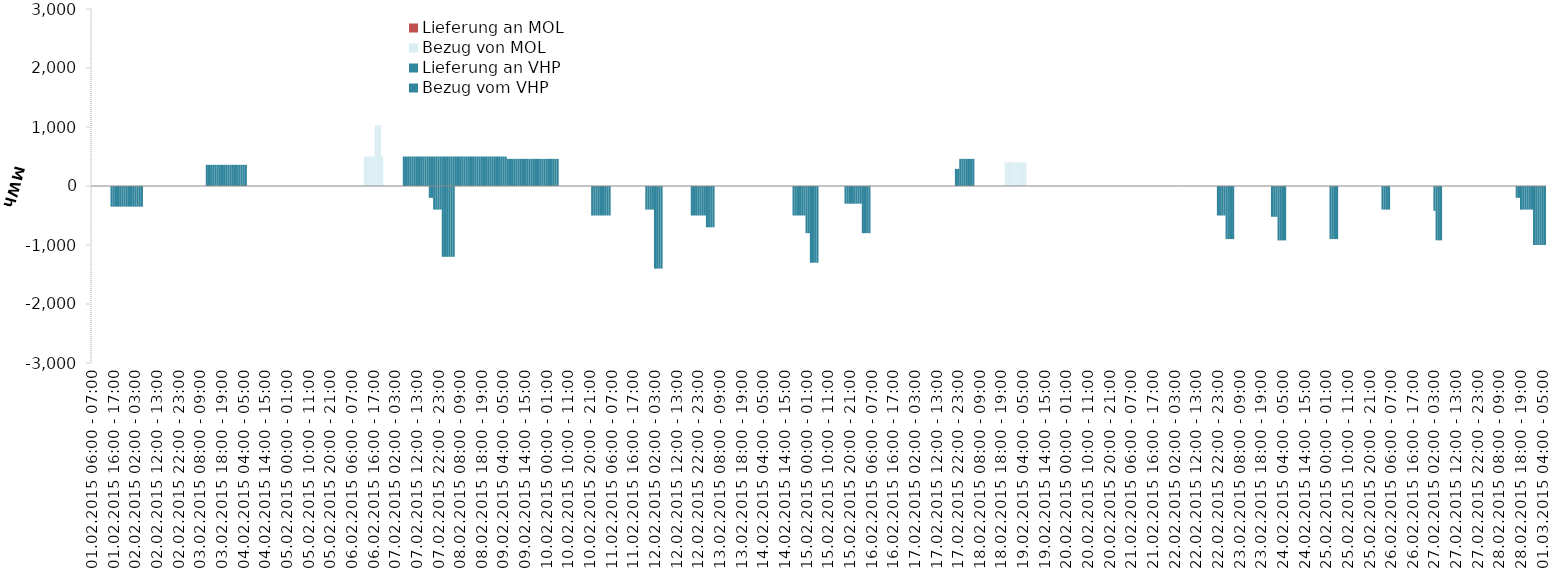
| Category | Bezug vom VHP | Lieferung an VHP | Bezug von MOL | Lieferung an MOL |
|---|---|---|---|---|
| 01.02.2015 06:00 - 07:00 | 0 | 0 | 0 | 0 |
| 01.02.2015 07:00 - 08:00 | 0 | 0 | 0 | 0 |
| 01.02.2015 08:00 - 09:00 | 0 | 0 | 0 | 0 |
| 01.02.2015 09:00 - 10:00 | 0 | 0 | 0 | 0 |
| 01.02.2015 10:00 - 11:00 | 0 | 0 | 0 | 0 |
| 01.02.2015 11:00 - 12:00 | 0 | 0 | 0 | 0 |
| 01.02.2015 12:00 - 13:00 | 0 | 0 | 0 | 0 |
| 01.02.2015 13:00 - 14:00 | 0 | 0 | 0 | 0 |
| 01.02.2015 14:00 - 15:00 | 0 | 0 | 0 | 0 |
| 01.02.2015 15:00 - 16:00 | 0 | -350 | 0 | 0 |
| 01.02.2015 16:00 - 17:00 | 0 | -350 | 0 | 0 |
| 01.02.2015 17:00 - 18:00 | 0 | -350 | 0 | 0 |
| 01.02.2015 18:00 - 19:00 | 0 | -350 | 0 | 0 |
| 01.02.2015 19:00 - 20:00 | 0 | -350 | 0 | 0 |
| 01.02.2015 20:00 - 21:00 | 0 | -350 | 0 | 0 |
| 01.02.2015 21:00 - 22:00 | 0 | -350 | 0 | 0 |
| 01.02.2015 22:00 - 23:00 | 0 | -350 | 0 | 0 |
| 01.02.2015 23:00 - 24:00 | 0 | -350 | 0 | 0 |
| 02.02.2015 00:00 - 01:00 | 0 | -350 | 0 | 0 |
| 02.02.2015 01:00 - 02:00 | 0 | -350 | 0 | 0 |
| 02.02.2015 02:00 - 03:00 | 0 | -350 | 0 | 0 |
| 02.02.2015 03:00 - 04:00 | 0 | -350 | 0 | 0 |
| 02.02.2015 04:00 - 05:00 | 0 | -350 | 0 | 0 |
| 02.02.2015 05:00 - 06:00 | 0 | -350 | 0 | 0 |
| 02.02.2015 06:00 - 07:00 | 0 | 0 | 0 | 0 |
| 02.02.2015 07:00 - 08:00 | 0 | 0 | 0 | 0 |
| 02.02.2015 08:00 - 09:00 | 0 | 0 | 0 | 0 |
| 02.02.2015 09:00 - 10:00 | 0 | 0 | 0 | 0 |
| 02.02.2015 10:00 - 11:00 | 0 | 0 | 0 | 0 |
| 02.02.2015 11:00 - 12:00 | 0 | 0 | 0 | 0 |
| 02.02.2015 12:00 - 13:00 | 0 | 0 | 0 | 0 |
| 02.02.2015 13:00 - 14:00 | 0 | 0 | 0 | 0 |
| 02.02.2015 14:00 - 15:00 | 0 | 0 | 0 | 0 |
| 02.02.2015 15:00 - 16:00 | 0 | 0 | 0 | 0 |
| 02.02.2015 16:00 - 17:00 | 0 | 0 | 0 | 0 |
| 02.02.2015 17:00 - 18:00 | 0 | 0 | 0 | 0 |
| 02.02.2015 18:00 - 19:00 | 0 | 0 | 0 | 0 |
| 02.02.2015 19:00 - 20:00 | 0 | 0 | 0 | 0 |
| 02.02.2015 20:00 - 21:00 | 0 | 0 | 0 | 0 |
| 02.02.2015 21:00 - 22:00 | 0 | 0 | 0 | 0 |
| 02.02.2015 22:00 - 23:00 | 0 | 0 | 0 | 0 |
| 02.02.2015 23:00 - 24:00 | 0 | 0 | 0 | 0 |
| 03.02.2015 00:00 - 01:00 | 0 | 0 | 0 | 0 |
| 03.02.2015 01:00 - 02:00 | 0 | 0 | 0 | 0 |
| 03.02.2015 02:00 - 03:00 | 0 | 0 | 0 | 0 |
| 03.02.2015 03:00 - 04:00 | 0 | 0 | 0 | 0 |
| 03.02.2015 04:00 - 05:00 | 0 | 0 | 0 | 0 |
| 03.02.2015 05:00 - 06:00 | 0 | 0 | 0 | 0 |
| 03.02.2015 06:00 - 07:00 | 0 | 0 | 0 | 0 |
| 03.02.2015 07:00 - 08:00 | 0 | 0 | 0 | 0 |
| 03.02.2015 08:00 - 09:00 | 0 | 0 | 0 | 0 |
| 03.02.2015 09:00 - 10:00 | 0 | 0 | 0 | 0 |
| 03.02.2015 10:00 - 11:00 | 0 | 0 | 0 | 0 |
| 03.02.2015 11:00 - 12:00 | 359 | 0 | 0 | 0 |
| 03.02.2015 12:00 - 13:00 | 359 | 0 | 0 | 0 |
| 03.02.2015 13:00 - 14:00 | 359 | 0 | 0 | 0 |
| 03.02.2015 14:00 - 15:00 | 359 | 0 | 0 | 0 |
| 03.02.2015 15:00 - 16:00 | 359 | 0 | 0 | 0 |
| 03.02.2015 16:00 - 17:00 | 359 | 0 | 0 | 0 |
| 03.02.2015 17:00 - 18:00 | 359 | 0 | 0 | 0 |
| 03.02.2015 18:00 - 19:00 | 359 | 0 | 0 | 0 |
| 03.02.2015 19:00 - 20:00 | 359 | 0 | 0 | 0 |
| 03.02.2015 20:00 - 21:00 | 359 | 0 | 0 | 0 |
| 03.02.2015 21:00 - 22:00 | 359 | 0 | 0 | 0 |
| 03.02.2015 22:00 - 23:00 | 359 | 0 | 0 | 0 |
| 03.02.2015 23:00 - 24:00 | 359 | 0 | 0 | 0 |
| 04.02.2015 00:00 - 01:00 | 359 | 0 | 0 | 0 |
| 04.02.2015 01:00 - 02:00 | 359 | 0 | 0 | 0 |
| 04.02.2015 02:00 - 03:00 | 359 | 0 | 0 | 0 |
| 04.02.2015 03:00 - 04:00 | 359 | 0 | 0 | 0 |
| 04.02.2015 04:00 - 05:00 | 359 | 0 | 0 | 0 |
| 04.02.2015 05:00 - 06:00 | 359 | 0 | 0 | 0 |
| 04.02.2015 06:00 - 07:00 | 0 | 0 | 0 | 0 |
| 04.02.2015 07:00 - 08:00 | 0 | 0 | 0 | 0 |
| 04.02.2015 08:00 - 09:00 | 0 | 0 | 0 | 0 |
| 04.02.2015 09:00 - 10:00 | 0 | 0 | 0 | 0 |
| 04.02.2015 10:00 - 11:00 | 0 | 0 | 0 | 0 |
| 04.02.2015 11:00 - 12:00 | 0 | 0 | 0 | 0 |
| 04.02.2015 12:00 - 13:00 | 0 | 0 | 0 | 0 |
| 04.02.2015 13:00 - 14:00 | 0 | 0 | 0 | 0 |
| 04.02.2015 14:00 - 15:00 | 0 | 0 | 0 | 0 |
| 04.02.2015 15:00 - 16:00 | 0 | 0 | 0 | 0 |
| 04.02.2015 16:00 - 17:00 | 0 | 0 | 0 | 0 |
| 04.02.2015 17:00 - 18:00 | 0 | 0 | 0 | 0 |
| 04.02.2015 18:00 - 19:00 | 0 | 0 | 0 | 0 |
| 04.02.2015 19:00 - 20:00 | 0 | 0 | 0 | 0 |
| 04.02.2015 20:00 - 21:00 | 0 | 0 | 0 | 0 |
| 04.02.2015 21:00 - 22:00 | 0 | 0 | 0 | 0 |
| 04.02.2015 22:00 - 23:00 | 0 | 0 | 0 | 0 |
| 04.02.2015 23:00 - 24:00 | 0 | 0 | 0 | 0 |
| 05.02.2015 00:00 - 01:00 | 0 | 0 | 0 | 0 |
| 05.02.2015 01:00 - 02:00 | 0 | 0 | 0 | 0 |
| 05.02.2015 02:00 - 03:00 | 0 | 0 | 0 | 0 |
| 05.02.2015 03:00 - 04:00 | 0 | 0 | 0 | 0 |
| 05.02.2015 04:00 - 05:00 | 0 | 0 | 0 | 0 |
| 05.02.2015 05:00 - 06:00 | 0 | 0 | 0 | 0 |
| 05.02.2015 06:00 - 07:00 | 0 | 0 | 0 | 0 |
| 05.02.2015 07:00 - 08:00 | 0 | 0 | 0 | 0 |
| 05.02.2015 08:00 - 09:00 | 0 | 0 | 0 | 0 |
| 05.02.2015 09:00 - 10:00 | 0 | 0 | 0 | 0 |
| 05.02.2015 10:00 - 11:00 | 0 | 0 | 0 | 0 |
| 05.02.2015 11:00 - 12:00 | 0 | 0 | 0 | 0 |
| 05.02.2015 12:00 - 13:00 | 0 | 0 | 0 | 0 |
| 05.02.2015 13:00 - 14:00 | 0 | 0 | 0 | 0 |
| 05.02.2015 14:00 - 15:00 | 0 | 0 | 0 | 0 |
| 05.02.2015 15:00 - 16:00 | 0 | 0 | 0 | 0 |
| 05.02.2015 16:00 - 17:00 | 0 | 0 | 0 | 0 |
| 05.02.2015 17:00 - 18:00 | 0 | 0 | 0 | 0 |
| 05.02.2015 18:00 - 19:00 | 0 | 0 | 0 | 0 |
| 05.02.2015 19:00 - 20:00 | 0 | 0 | 0 | 0 |
| 05.02.2015 20:00 - 21:00 | 0 | 0 | 0 | 0 |
| 05.02.2015 21:00 - 22:00 | 0 | 0 | 0 | 0 |
| 05.02.2015 22:00 - 23:00 | 0 | 0 | 0 | 0 |
| 05.02.2015 23:00 - 24:00 | 0 | 0 | 0 | 0 |
| 06.02.2015 00:00 - 01:00 | 0 | 0 | 0 | 0 |
| 06.02.2015 01:00 - 02:00 | 0 | 0 | 0 | 0 |
| 06.02.2015 02:00 - 03:00 | 0 | 0 | 0 | 0 |
| 06.02.2015 03:00 - 04:00 | 0 | 0 | 0 | 0 |
| 06.02.2015 04:00 - 05:00 | 0 | 0 | 0 | 0 |
| 06.02.2015 05:00 - 06:00 | 0 | 0 | 0 | 0 |
| 06.02.2015 06:00 - 07:00 | 0 | 0 | 0 | 0 |
| 06.02.2015 07:00 - 08:00 | 0 | 0 | 0 | 0 |
| 06.02.2015 08:00 - 09:00 | 0 | 0 | 0 | 0 |
| 06.02.2015 09:00 - 10:00 | 0 | 0 | 0 | 0 |
| 06.02.2015 10:00 - 11:00 | 0 | 0 | 0 | 0 |
| 06.02.2015 11:00 - 12:00 | 0 | 0 | 0 | 0 |
| 06.02.2015 12:00 - 13:00 | 0 | 0 | 500 | 0 |
| 06.02.2015 13:00 - 14:00 | 0 | 0 | 500 | 0 |
| 06.02.2015 14:00 - 15:00 | 0 | 0 | 500 | 0 |
| 06.02.2015 15:00 - 16:00 | 0 | 0 | 500 | 0 |
| 06.02.2015 16:00 - 17:00 | 0 | 0 | 500 | 0 |
| 06.02.2015 17:00 - 18:00 | 0 | 0 | 1030 | 0 |
| 06.02.2015 18:00 - 19:00 | 0 | 0 | 1030 | 0 |
| 06.02.2015 19:00 - 20:00 | 0 | 0 | 1030 | 0 |
| 06.02.2015 20:00 - 21:00 | 0 | 0 | 500 | 0 |
| 06.02.2015 21:00 - 22:00 | 0 | 0 | 0 | 0 |
| 06.02.2015 22:00 - 23:00 | 0 | 0 | 0 | 0 |
| 06.02.2015 23:00 - 24:00 | 0 | 0 | 0 | 0 |
| 07.02.2015 00:00 - 01:00 | 0 | 0 | 0 | 0 |
| 07.02.2015 01:00 - 02:00 | 0 | 0 | 0 | 0 |
| 07.02.2015 02:00 - 03:00 | 0 | 0 | 0 | 0 |
| 07.02.2015 03:00 - 04:00 | 0 | 0 | 0 | 0 |
| 07.02.2015 04:00 - 05:00 | 0 | 0 | 0 | 0 |
| 07.02.2015 05:00 - 06:00 | 0 | 0 | 0 | 0 |
| 07.02.2015 06:00 - 07:00 | 500 | 0 | 0 | 0 |
| 07.02.2015 07:00 - 08:00 | 500 | 0 | 0 | 0 |
| 07.02.2015 08:00 - 09:00 | 500 | 0 | 0 | 0 |
| 07.02.2015 09:00 - 10:00 | 500 | 0 | 0 | 0 |
| 07.02.2015 10:00 - 11:00 | 500 | 0 | 0 | 0 |
| 07.02.2015 11:00 - 12:00 | 500 | 0 | 0 | 0 |
| 07.02.2015 12:00 - 13:00 | 500 | 0 | 0 | 0 |
| 07.02.2015 13:00 - 14:00 | 500 | 0 | 0 | 0 |
| 07.02.2015 14:00 - 15:00 | 500 | 0 | 0 | 0 |
| 07.02.2015 15:00 - 16:00 | 500 | 0 | 0 | 0 |
| 07.02.2015 16:00 - 17:00 | 500 | 0 | 0 | 0 |
| 07.02.2015 17:00 - 18:00 | 500 | 0 | 0 | 0 |
| 07.02.2015 18:00 - 19:00 | 500 | -200 | 0 | 0 |
| 07.02.2015 19:00 - 20:00 | 500 | -200 | 0 | 0 |
| 07.02.2015 20:00 - 21:00 | 500 | -400 | 0 | 0 |
| 07.02.2015 21:00 - 22:00 | 500 | -400 | 0 | 0 |
| 07.02.2015 22:00 - 23:00 | 500 | -400 | 0 | 0 |
| 07.02.2015 23:00 - 24:00 | 500 | -400 | 0 | 0 |
| 08.02.2015 00:00 - 01:00 | 500 | -1200 | 0 | 0 |
| 08.02.2015 01:00 - 02:00 | 500 | -1200 | 0 | 0 |
| 08.02.2015 02:00 - 03:00 | 500 | -1200 | 0 | 0 |
| 08.02.2015 03:00 - 04:00 | 500 | -1200 | 0 | 0 |
| 08.02.2015 04:00 - 05:00 | 500 | -1200 | 0 | 0 |
| 08.02.2015 05:00 - 06:00 | 500 | -1200 | 0 | 0 |
| 08.02.2015 06:00 - 07:00 | 500 | 0 | 0 | 0 |
| 08.02.2015 07:00 - 08:00 | 500 | 0 | 0 | 0 |
| 08.02.2015 08:00 - 09:00 | 500 | 0 | 0 | 0 |
| 08.02.2015 09:00 - 10:00 | 500 | 0 | 0 | 0 |
| 08.02.2015 10:00 - 11:00 | 500 | 0 | 0 | 0 |
| 08.02.2015 11:00 - 12:00 | 500 | 0 | 0 | 0 |
| 08.02.2015 12:00 - 13:00 | 500 | 0 | 0 | 0 |
| 08.02.2015 13:00 - 14:00 | 500 | 0 | 0 | 0 |
| 08.02.2015 14:00 - 15:00 | 500 | 0 | 0 | 0 |
| 08.02.2015 15:00 - 16:00 | 500 | 0 | 0 | 0 |
| 08.02.2015 16:00 - 17:00 | 500 | 0 | 0 | 0 |
| 08.02.2015 17:00 - 18:00 | 500 | 0 | 0 | 0 |
| 08.02.2015 18:00 - 19:00 | 500 | 0 | 0 | 0 |
| 08.02.2015 19:00 - 20:00 | 500 | 0 | 0 | 0 |
| 08.02.2015 20:00 - 21:00 | 500 | 0 | 0 | 0 |
| 08.02.2015 21:00 - 22:00 | 500 | 0 | 0 | 0 |
| 08.02.2015 22:00 - 23:00 | 500 | 0 | 0 | 0 |
| 08.02.2015 23:00 - 24:00 | 500 | 0 | 0 | 0 |
| 09.02.2015 00:00 - 01:00 | 500 | 0 | 0 | 0 |
| 09.02.2015 01:00 - 02:00 | 500 | 0 | 0 | 0 |
| 09.02.2015 02:00 - 03:00 | 500 | 0 | 0 | 0 |
| 09.02.2015 03:00 - 04:00 | 500 | 0 | 0 | 0 |
| 09.02.2015 04:00 - 05:00 | 500 | 0 | 0 | 0 |
| 09.02.2015 05:00 - 06:00 | 500 | 0 | 0 | 0 |
| 09.02.2015 06:00 - 07:00 | 460 | 0 | 0 | 0 |
| 09.02.2015 07:00 - 08:00 | 460 | 0 | 0 | 0 |
| 09.02.2015 08:00 - 09:00 | 460 | 0 | 0 | 0 |
| 09.02.2015 09:00 - 10:00 | 460 | 0 | 0 | 0 |
| 09.02.2015 10:00 - 11:00 | 460 | 0 | 0 | 0 |
| 09.02.2015 11:00 - 12:00 | 460 | 0 | 0 | 0 |
| 09.02.2015 12:00 - 13:00 | 460 | 0 | 0 | 0 |
| 09.02.2015 13:00 - 14:00 | 460 | 0 | 0 | 0 |
| 09.02.2015 14:00 - 15:00 | 460 | 0 | 0 | 0 |
| 09.02.2015 15:00 - 16:00 | 460 | 0 | 0 | 0 |
| 09.02.2015 16:00 - 17:00 | 460 | 0 | 0 | 0 |
| 09.02.2015 17:00 - 18:00 | 460 | 0 | 0 | 0 |
| 09.02.2015 18:00 - 19:00 | 460 | 0 | 0 | 0 |
| 09.02.2015 19:00 - 20:00 | 460 | 0 | 0 | 0 |
| 09.02.2015 20:00 - 21:00 | 460 | 0 | 0 | 0 |
| 09.02.2015 21:00 - 22:00 | 460 | 0 | 0 | 0 |
| 09.02.2015 22:00 - 23:00 | 460 | 0 | 0 | 0 |
| 09.02.2015 23:00 - 24:00 | 460 | 0 | 0 | 0 |
| 10.02.2015 00:00 - 01:00 | 460 | 0 | 0 | 0 |
| 10.02.2015 01:00 - 02:00 | 460 | 0 | 0 | 0 |
| 10.02.2015 02:00 - 03:00 | 460 | 0 | 0 | 0 |
| 10.02.2015 03:00 - 04:00 | 460 | 0 | 0 | 0 |
| 10.02.2015 04:00 - 05:00 | 460 | 0 | 0 | 0 |
| 10.02.2015 05:00 - 06:00 | 460 | 0 | 0 | 0 |
| 10.02.2015 06:00 - 07:00 | 0 | 0 | 0 | 0 |
| 10.02.2015 07:00 - 08:00 | 0 | 0 | 0 | 0 |
| 10.02.2015 08:00 - 09:00 | 0 | 0 | 0 | 0 |
| 10.02.2015 09:00 - 10:00 | 0 | 0 | 0 | 0 |
| 10.02.2015 10:00 - 11:00 | 0 | 0 | 0 | 0 |
| 10.02.2015 11:00 - 12:00 | 0 | 0 | 0 | 0 |
| 10.02.2015 12:00 - 13:00 | 0 | 0 | 0 | 0 |
| 10.02.2015 13:00 - 14:00 | 0 | 0 | 0 | 0 |
| 10.02.2015 14:00 - 15:00 | 0 | 0 | 0 | 0 |
| 10.02.2015 15:00 - 16:00 | 0 | 0 | 0 | 0 |
| 10.02.2015 16:00 - 17:00 | 0 | 0 | 0 | 0 |
| 10.02.2015 17:00 - 18:00 | 0 | 0 | 0 | 0 |
| 10.02.2015 18:00 - 19:00 | 0 | 0 | 0 | 0 |
| 10.02.2015 19:00 - 20:00 | 0 | 0 | 0 | 0 |
| 10.02.2015 20:00 - 21:00 | 0 | 0 | 0 | 0 |
| 10.02.2015 21:00 - 22:00 | 0 | -500 | 0 | 0 |
| 10.02.2015 22:00 - 23:00 | 0 | -500 | 0 | 0 |
| 10.02.2015 23:00 - 24:00 | 0 | -500 | 0 | 0 |
| 11.02.2015 00:00 - 01:00 | 0 | -500 | 0 | 0 |
| 11.02.2015 01:00 - 02:00 | 0 | -500 | 0 | 0 |
| 11.02.2015 02:00 - 03:00 | 0 | -500 | 0 | 0 |
| 11.02.2015 03:00 - 04:00 | 0 | -500 | 0 | 0 |
| 11.02.2015 04:00 - 05:00 | 0 | -500 | 0 | 0 |
| 11.02.2015 05:00 - 06:00 | 0 | -500 | 0 | 0 |
| 11.02.2015 06:00 - 07:00 | 0 | 0 | 0 | 0 |
| 11.02.2015 07:00 - 08:00 | 0 | 0 | 0 | 0 |
| 11.02.2015 08:00 - 09:00 | 0 | 0 | 0 | 0 |
| 11.02.2015 09:00 - 10:00 | 0 | 0 | 0 | 0 |
| 11.02.2015 10:00 - 11:00 | 0 | 0 | 0 | 0 |
| 11.02.2015 11:00 - 12:00 | 0 | 0 | 0 | 0 |
| 11.02.2015 12:00 - 13:00 | 0 | 0 | 0 | 0 |
| 11.02.2015 13:00 - 14:00 | 0 | 0 | 0 | 0 |
| 11.02.2015 14:00 - 15:00 | 0 | 0 | 0 | 0 |
| 11.02.2015 15:00 - 16:00 | 0 | 0 | 0 | 0 |
| 11.02.2015 16:00 - 17:00 | 0 | 0 | 0 | 0 |
| 11.02.2015 17:00 - 18:00 | 0 | 0 | 0 | 0 |
| 11.02.2015 18:00 - 19:00 | 0 | 0 | 0 | 0 |
| 11.02.2015 19:00 - 20:00 | 0 | 0 | 0 | 0 |
| 11.02.2015 20:00 - 21:00 | 0 | 0 | 0 | 0 |
| 11.02.2015 21:00 - 22:00 | 0 | 0 | 0 | 0 |
| 11.02.2015 22:00 - 23:00 | 0 | -400 | 0 | 0 |
| 11.02.2015 23:00 - 24:00 | 0 | -400 | 0 | 0 |
| 12.02.2015 00:00 - 01:00 | 0 | -400 | 0 | 0 |
| 12.02.2015 01:00 - 02:00 | 0 | -400 | 0 | 0 |
| 12.02.2015 02:00 - 03:00 | 0 | -1400 | 0 | 0 |
| 12.02.2015 03:00 - 04:00 | 0 | -1400 | 0 | 0 |
| 12.02.2015 04:00 - 05:00 | 0 | -1400 | 0 | 0 |
| 12.02.2015 05:00 - 06:00 | 0 | -1400 | 0 | 0 |
| 12.02.2015 06:00 - 07:00 | 0 | 0 | 0 | 0 |
| 12.02.2015 07:00 - 08:00 | 0 | 0 | 0 | 0 |
| 12.02.2015 08:00 - 09:00 | 0 | 0 | 0 | 0 |
| 12.02.2015 09:00 - 10:00 | 0 | 0 | 0 | 0 |
| 12.02.2015 10:00 - 11:00 | 0 | 0 | 0 | 0 |
| 12.02.2015 11:00 - 12:00 | 0 | 0 | 0 | 0 |
| 12.02.2015 12:00 - 13:00 | 0 | 0 | 0 | 0 |
| 12.02.2015 13:00 - 14:00 | 0 | 0 | 0 | 0 |
| 12.02.2015 14:00 - 15:00 | 0 | 0 | 0 | 0 |
| 12.02.2015 15:00 - 16:00 | 0 | 0 | 0 | 0 |
| 12.02.2015 16:00 - 17:00 | 0 | 0 | 0 | 0 |
| 12.02.2015 17:00 - 18:00 | 0 | 0 | 0 | 0 |
| 12.02.2015 18:00 - 19:00 | 0 | 0 | 0 | 0 |
| 12.02.2015 19:00 - 20:00 | 0 | -500 | 0 | 0 |
| 12.02.2015 20:00 - 21:00 | 0 | -500 | 0 | 0 |
| 12.02.2015 21:00 - 22:00 | 0 | -500 | 0 | 0 |
| 12.02.2015 22:00 - 23:00 | 0 | -500 | 0 | 0 |
| 12.02.2015 23:00 - 24:00 | 0 | -500 | 0 | 0 |
| 13.02.2015 00:00 - 01:00 | 0 | -500 | 0 | 0 |
| 13.02.2015 01:00 - 02:00 | 0 | -500 | 0 | 0 |
| 13.02.2015 02:00 - 03:00 | 0 | -700 | 0 | 0 |
| 13.02.2015 03:00 - 04:00 | 0 | -700 | 0 | 0 |
| 13.02.2015 04:00 - 05:00 | 0 | -700 | 0 | 0 |
| 13.02.2015 05:00 - 06:00 | 0 | -700 | 0 | 0 |
| 13.02.2015 06:00 - 07:00 | 0 | 0 | 0 | 0 |
| 13.02.2015 07:00 - 08:00 | 0 | 0 | 0 | 0 |
| 13.02.2015 08:00 - 09:00 | 0 | 0 | 0 | 0 |
| 13.02.2015 09:00 - 10:00 | 0 | 0 | 0 | 0 |
| 13.02.2015 10:00 - 11:00 | 0 | 0 | 0 | 0 |
| 13.02.2015 11:00 - 12:00 | 0 | 0 | 0 | 0 |
| 13.02.2015 12:00 - 13:00 | 0 | 0 | 0 | 0 |
| 13.02.2015 13:00 - 14:00 | 0 | 0 | 0 | 0 |
| 13.02.2015 14:00 - 15:00 | 0 | 0 | 0 | 0 |
| 13.02.2015 15:00 - 16:00 | 0 | 0 | 0 | 0 |
| 13.02.2015 16:00 - 17:00 | 0 | 0 | 0 | 0 |
| 13.02.2015 17:00 - 18:00 | 0 | 0 | 0 | 0 |
| 13.02.2015 18:00 - 19:00 | 0 | 0 | 0 | 0 |
| 13.02.2015 19:00 - 20:00 | 0 | 0 | 0 | 0 |
| 13.02.2015 20:00 - 21:00 | 0 | 0 | 0 | 0 |
| 13.02.2015 21:00 - 22:00 | 0 | 0 | 0 | 0 |
| 13.02.2015 22:00 - 23:00 | 0 | 0 | 0 | 0 |
| 13.02.2015 23:00 - 24:00 | 0 | 0 | 0 | 0 |
| 14.02.2015 00:00 - 01:00 | 0 | 0 | 0 | 0 |
| 14.02.2015 01:00 - 02:00 | 0 | 0 | 0 | 0 |
| 14.02.2015 02:00 - 03:00 | 0 | 0 | 0 | 0 |
| 14.02.2015 03:00 - 04:00 | 0 | 0 | 0 | 0 |
| 14.02.2015 04:00 - 05:00 | 0 | 0 | 0 | 0 |
| 14.02.2015 05:00 - 06:00 | 0 | 0 | 0 | 0 |
| 14.02.2015 06:00 - 07:00 | 0 | 0 | 0 | 0 |
| 14.02.2015 07:00 - 08:00 | 0 | 0 | 0 | 0 |
| 14.02.2015 08:00 - 09:00 | 0 | 0 | 0 | 0 |
| 14.02.2015 09:00 - 10:00 | 0 | 0 | 0 | 0 |
| 14.02.2015 10:00 - 11:00 | 0 | 0 | 0 | 0 |
| 14.02.2015 11:00 - 12:00 | 0 | 0 | 0 | 0 |
| 14.02.2015 12:00 - 13:00 | 0 | 0 | 0 | 0 |
| 14.02.2015 13:00 - 14:00 | 0 | 0 | 0 | 0 |
| 14.02.2015 14:00 - 15:00 | 0 | 0 | 0 | 0 |
| 14.02.2015 15:00 - 16:00 | 0 | 0 | 0 | 0 |
| 14.02.2015 16:00 - 17:00 | 0 | 0 | 0 | 0 |
| 14.02.2015 17:00 - 18:00 | 0 | 0 | 0 | 0 |
| 14.02.2015 18:00 - 19:00 | 0 | -500 | 0 | 0 |
| 14.02.2015 19:00 - 20:00 | 0 | -500 | 0 | 0 |
| 14.02.2015 20:00 - 21:00 | 0 | -500 | 0 | 0 |
| 14.02.2015 21:00 - 22:00 | 0 | -500 | 0 | 0 |
| 14.02.2015 22:00 - 23:00 | 0 | -500 | 0 | 0 |
| 14.02.2015 23:00 - 24:00 | 0 | -500 | 0 | 0 |
| 15.02.2015 00:00 - 01:00 | 0 | -800 | 0 | 0 |
| 15.02.2015 01:00 - 02:00 | 0 | -800 | 0 | 0 |
| 15.02.2015 02:00 - 03:00 | 0 | -1300 | 0 | 0 |
| 15.02.2015 03:00 - 04:00 | 0 | -1300 | 0 | 0 |
| 15.02.2015 04:00 - 05:00 | 0 | -1300 | 0 | 0 |
| 15.02.2015 05:00 - 06:00 | 0 | -1300 | 0 | 0 |
| 15.02.2015 06:00 - 07:00 | 0 | 0 | 0 | 0 |
| 15.02.2015 07:00 - 08:00 | 0 | 0 | 0 | 0 |
| 15.02.2015 08:00 - 09:00 | 0 | 0 | 0 | 0 |
| 15.02.2015 09:00 - 10:00 | 0 | 0 | 0 | 0 |
| 15.02.2015 10:00 - 11:00 | 0 | 0 | 0 | 0 |
| 15.02.2015 11:00 - 12:00 | 0 | 0 | 0 | 0 |
| 15.02.2015 12:00 - 13:00 | 0 | 0 | 0 | 0 |
| 15.02.2015 13:00 - 14:00 | 0 | 0 | 0 | 0 |
| 15.02.2015 14:00 - 15:00 | 0 | 0 | 0 | 0 |
| 15.02.2015 15:00 - 16:00 | 0 | 0 | 0 | 0 |
| 15.02.2015 16:00 - 17:00 | 0 | 0 | 0 | 0 |
| 15.02.2015 17:00 - 18:00 | 0 | 0 | 0 | 0 |
| 15.02.2015 18:00 - 19:00 | 0 | -300 | 0 | 0 |
| 15.02.2015 19:00 - 20:00 | 0 | -300 | 0 | 0 |
| 15.02.2015 20:00 - 21:00 | 0 | -300 | 0 | 0 |
| 15.02.2015 21:00 - 22:00 | 0 | -300 | 0 | 0 |
| 15.02.2015 22:00 - 23:00 | 0 | -300 | 0 | 0 |
| 15.02.2015 23:00 - 24:00 | 0 | -300 | 0 | 0 |
| 16.02.2015 00:00 - 01:00 | 0 | -300 | 0 | 0 |
| 16.02.2015 01:00 - 02:00 | 0 | -300 | 0 | 0 |
| 16.02.2015 02:00 - 03:00 | 0 | -800 | 0 | 0 |
| 16.02.2015 03:00 - 04:00 | 0 | -800 | 0 | 0 |
| 16.02.2015 04:00 - 05:00 | 0 | -800 | 0 | 0 |
| 16.02.2015 05:00 - 06:00 | 0 | -800 | 0 | 0 |
| 16.02.2015 06:00 - 07:00 | 0 | 0 | 0 | 0 |
| 16.02.2015 07:00 - 08:00 | 0 | 0 | 0 | 0 |
| 16.02.2015 08:00 - 09:00 | 0 | 0 | 0 | 0 |
| 16.02.2015 09:00 - 10:00 | 0 | 0 | 0 | 0 |
| 16.02.2015 10:00 - 11:00 | 0 | 0 | 0 | 0 |
| 16.02.2015 11:00 - 12:00 | 0 | 0 | 0 | 0 |
| 16.02.2015 12:00 - 13:00 | 0 | 0 | 0 | 0 |
| 16.02.2015 13:00 - 14:00 | 0 | 0 | 0 | 0 |
| 16.02.2015 14:00 - 15:00 | 0 | 0 | 0 | 0 |
| 16.02.2015 15:00 - 16:00 | 0 | 0 | 0 | 0 |
| 16.02.2015 16:00 - 17:00 | 0 | 0 | 0 | 0 |
| 16.02.2015 17:00 - 18:00 | 0 | 0 | 0 | 0 |
| 16.02.2015 18:00 - 19:00 | 0 | 0 | 0 | 0 |
| 16.02.2015 19:00 - 20:00 | 0 | 0 | 0 | 0 |
| 16.02.2015 20:00 - 21:00 | 0 | 0 | 0 | 0 |
| 16.02.2015 21:00 - 22:00 | 0 | 0 | 0 | 0 |
| 16.02.2015 22:00 - 23:00 | 0 | 0 | 0 | 0 |
| 16.02.2015 23:00 - 24:00 | 0 | 0 | 0 | 0 |
| 17.02.2015 00:00 - 01:00 | 0 | 0 | 0 | 0 |
| 17.02.2015 01:00 - 02:00 | 0 | 0 | 0 | 0 |
| 17.02.2015 02:00 - 03:00 | 0 | 0 | 0 | 0 |
| 17.02.2015 03:00 - 04:00 | 0 | 0 | 0 | 0 |
| 17.02.2015 04:00 - 05:00 | 0 | 0 | 0 | 0 |
| 17.02.2015 05:00 - 06:00 | 0 | 0 | 0 | 0 |
| 17.02.2015 06:00 - 07:00 | 0 | 0 | 0 | 0 |
| 17.02.2015 07:00 - 08:00 | 0 | 0 | 0 | 0 |
| 17.02.2015 08:00 - 09:00 | 0 | 0 | 0 | 0 |
| 17.02.2015 09:00 - 10:00 | 0 | 0 | 0 | 0 |
| 17.02.2015 10:00 - 11:00 | 0 | 0 | 0 | 0 |
| 17.02.2015 11:00 - 12:00 | 0 | 0 | 0 | 0 |
| 17.02.2015 12:00 - 13:00 | 0 | 0 | 0 | 0 |
| 17.02.2015 13:00 - 14:00 | 0 | 0 | 0 | 0 |
| 17.02.2015 14:00 - 15:00 | 0 | 0 | 0 | 0 |
| 17.02.2015 15:00 - 16:00 | 0 | 0 | 0 | 0 |
| 17.02.2015 16:00 - 17:00 | 0 | 0 | 0 | 0 |
| 17.02.2015 17:00 - 18:00 | 0 | 0 | 0 | 0 |
| 17.02.2015 18:00 - 19:00 | 0 | 0 | 0 | 0 |
| 17.02.2015 19:00 - 20:00 | 0 | 0 | 0 | 0 |
| 17.02.2015 20:00 - 21:00 | 0 | 0 | 0 | 0 |
| 17.02.2015 21:00 - 22:00 | 290 | 0 | 0 | 0 |
| 17.02.2015 22:00 - 23:00 | 290 | 0 | 0 | 0 |
| 17.02.2015 23:00 - 24:00 | 460 | 0 | 0 | 0 |
| 18.02.2015 00:00 - 01:00 | 460 | 0 | 0 | 0 |
| 18.02.2015 01:00 - 02:00 | 460 | 0 | 0 | 0 |
| 18.02.2015 02:00 - 03:00 | 460 | 0 | 0 | 0 |
| 18.02.2015 03:00 - 04:00 | 460 | 0 | 0 | 0 |
| 18.02.2015 04:00 - 05:00 | 460 | 0 | 0 | 0 |
| 18.02.2015 05:00 - 06:00 | 460 | 0 | 0 | 0 |
| 18.02.2015 06:00 - 07:00 | 0 | 0 | 0 | 0 |
| 18.02.2015 07:00 - 08:00 | 0 | 0 | 0 | 0 |
| 18.02.2015 08:00 - 09:00 | 0 | 0 | 0 | 0 |
| 18.02.2015 09:00 - 10:00 | 0 | 0 | 0 | 0 |
| 18.02.2015 10:00 - 11:00 | 0 | 0 | 0 | 0 |
| 18.02.2015 11:00 - 12:00 | 0 | 0 | 0 | 0 |
| 18.02.2015 12:00 - 13:00 | 0 | 0 | 0 | 0 |
| 18.02.2015 13:00 - 14:00 | 0 | 0 | 0 | 0 |
| 18.02.2015 14:00 - 15:00 | 0 | 0 | 0 | 0 |
| 18.02.2015 15:00 - 16:00 | 0 | 0 | 0 | 0 |
| 18.02.2015 16:00 - 17:00 | 0 | 0 | 0 | 0 |
| 18.02.2015 17:00 - 18:00 | 0 | 0 | 0 | 0 |
| 18.02.2015 18:00 - 19:00 | 0 | 0 | 0 | 0 |
| 18.02.2015 19:00 - 20:00 | 0 | 0 | 0 | 0 |
| 18.02.2015 20:00 - 21:00 | 0 | 0 | 400 | 0 |
| 18.02.2015 21:00 - 22:00 | 0 | 0 | 400 | 0 |
| 18.02.2015 22:00 - 23:00 | 0 | 0 | 400 | 0 |
| 18.02.2015 23:00 - 24:00 | 0 | 0 | 400 | 0 |
| 19.02.2015 00:00 - 01:00 | 0 | 0 | 400 | 0 |
| 19.02.2015 01:00 - 02:00 | 0 | 0 | 400 | 0 |
| 19.02.2015 02:00 - 03:00 | 0 | 0 | 400 | 0 |
| 19.02.2015 03:00 - 04:00 | 0 | 0 | 400 | 0 |
| 19.02.2015 04:00 - 05:00 | 0 | 0 | 400 | 0 |
| 19.02.2015 05:00 - 06:00 | 0 | 0 | 400 | 0 |
| 19.02.2015 06:00 - 07:00 | 0 | 0 | 0 | 0 |
| 19.02.2015 07:00 - 08:00 | 0 | 0 | 0 | 0 |
| 19.02.2015 08:00 - 09:00 | 0 | 0 | 0 | 0 |
| 19.02.2015 09:00 - 10:00 | 0 | 0 | 0 | 0 |
| 19.02.2015 10:00 - 11:00 | 0 | 0 | 0 | 0 |
| 19.02.2015 11:00 - 12:00 | 0 | 0 | 0 | 0 |
| 19.02.2015 12:00 - 13:00 | 0 | 0 | 0 | 0 |
| 19.02.2015 13:00 - 14:00 | 0 | 0 | 0 | 0 |
| 19.02.2015 14:00 - 15:00 | 0 | 0 | 0 | 0 |
| 19.02.2015 15:00 - 16:00 | 0 | 0 | 0 | 0 |
| 19.02.2015 16:00 - 17:00 | 0 | 0 | 0 | 0 |
| 19.02.2015 17:00 - 18:00 | 0 | 0 | 0 | 0 |
| 19.02.2015 18:00 - 19:00 | 0 | 0 | 0 | 0 |
| 19.02.2015 19:00 - 20:00 | 0 | 0 | 0 | 0 |
| 19.02.2015 20:00 - 21:00 | 0 | 0 | 0 | 0 |
| 19.02.2015 21:00 - 22:00 | 0 | 0 | 0 | 0 |
| 19.02.2015 22:00 - 23:00 | 0 | 0 | 0 | 0 |
| 19.02.2015 23:00 - 24:00 | 0 | 0 | 0 | 0 |
| 20.02.2015 00:00 - 01:00 | 0 | 0 | 0 | 0 |
| 20.02.2015 01:00 - 02:00 | 0 | 0 | 0 | 0 |
| 20.02.2015 02:00 - 03:00 | 0 | 0 | 0 | 0 |
| 20.02.2015 03:00 - 04:00 | 0 | 0 | 0 | 0 |
| 20.02.2015 04:00 - 05:00 | 0 | 0 | 0 | 0 |
| 20.02.2015 05:00 - 06:00 | 0 | 0 | 0 | 0 |
| 20.02.2015 06:00 - 07:00 | 0 | 0 | 0 | 0 |
| 20.02.2015 07:00 - 08:00 | 0 | 0 | 0 | 0 |
| 20.02.2015 08:00 - 09:00 | 0 | 0 | 0 | 0 |
| 20.02.2015 09:00 - 10:00 | 0 | 0 | 0 | 0 |
| 20.02.2015 10:00 - 11:00 | 0 | 0 | 0 | 0 |
| 20.02.2015 11:00 - 12:00 | 0 | 0 | 0 | 0 |
| 20.02.2015 12:00 - 13:00 | 0 | 0 | 0 | 0 |
| 20.02.2015 13:00 - 14:00 | 0 | 0 | 0 | 0 |
| 20.02.2015 14:00 - 15:00 | 0 | 0 | 0 | 0 |
| 20.02.2015 15:00 - 16:00 | 0 | 0 | 0 | 0 |
| 20.02.2015 16:00 - 17:00 | 0 | 0 | 0 | 0 |
| 20.02.2015 17:00 - 18:00 | 0 | 0 | 0 | 0 |
| 20.02.2015 18:00 - 19:00 | 0 | 0 | 0 | 0 |
| 20.02.2015 19:00 - 20:00 | 0 | 0 | 0 | 0 |
| 20.02.2015 20:00 - 21:00 | 0 | 0 | 0 | 0 |
| 20.02.2015 21:00 - 22:00 | 0 | 0 | 0 | 0 |
| 20.02.2015 22:00 - 23:00 | 0 | 0 | 0 | 0 |
| 20.02.2015 23:00 - 24:00 | 0 | 0 | 0 | 0 |
| 21.02.2015 00:00 - 01:00 | 0 | 0 | 0 | 0 |
| 21.02.2015 01:00 - 02:00 | 0 | 0 | 0 | 0 |
| 21.02.2015 02:00 - 03:00 | 0 | 0 | 0 | 0 |
| 21.02.2015 03:00 - 04:00 | 0 | 0 | 0 | 0 |
| 21.02.2015 04:00 - 05:00 | 0 | 0 | 0 | 0 |
| 21.02.2015 05:00 - 06:00 | 0 | 0 | 0 | 0 |
| 21.02.2015 06:00 - 07:00 | 0 | 0 | 0 | 0 |
| 21.02.2015 07:00 - 08:00 | 0 | 0 | 0 | 0 |
| 21.02.2015 08:00 - 09:00 | 0 | 0 | 0 | 0 |
| 21.02.2015 09:00 - 10:00 | 0 | 0 | 0 | 0 |
| 21.02.2015 10:00 - 11:00 | 0 | 0 | 0 | 0 |
| 21.02.2015 11:00 - 12:00 | 0 | 0 | 0 | 0 |
| 21.02.2015 12:00 - 13:00 | 0 | 0 | 0 | 0 |
| 21.02.2015 13:00 - 14:00 | 0 | 0 | 0 | 0 |
| 21.02.2015 14:00 - 15:00 | 0 | 0 | 0 | 0 |
| 21.02.2015 15:00 - 16:00 | 0 | 0 | 0 | 0 |
| 21.02.2015 16:00 - 17:00 | 0 | 0 | 0 | 0 |
| 21.02.2015 17:00 - 18:00 | 0 | 0 | 0 | 0 |
| 21.02.2015 18:00 - 19:00 | 0 | 0 | 0 | 0 |
| 21.02.2015 19:00 - 20:00 | 0 | 0 | 0 | 0 |
| 21.02.2015 20:00 - 21:00 | 0 | 0 | 0 | 0 |
| 21.02.2015 21:00 - 22:00 | 0 | 0 | 0 | 0 |
| 21.02.2015 22:00 - 23:00 | 0 | 0 | 0 | 0 |
| 21.02.2015 23:00 - 24:00 | 0 | 0 | 0 | 0 |
| 22.02.2015 00:00 - 01:00 | 0 | 0 | 0 | 0 |
| 22.02.2015 01:00 - 02:00 | 0 | 0 | 0 | 0 |
| 22.02.2015 02:00 - 03:00 | 0 | 0 | 0 | 0 |
| 22.02.2015 03:00 - 04:00 | 0 | 0 | 0 | 0 |
| 22.02.2015 04:00 - 05:00 | 0 | 0 | 0 | 0 |
| 22.02.2015 05:00 - 06:00 | 0 | 0 | 0 | 0 |
| 22.02.2015 06:00 - 07:00 | 0 | 0 | 0 | 0 |
| 22.02.2015 07:00 - 08:00 | 0 | 0 | 0 | 0 |
| 22.02.2015 08:00 - 09:00 | 0 | 0 | 0 | 0 |
| 22.02.2015 09:00 - 10:00 | 0 | 0 | 0 | 0 |
| 22.02.2015 10:00 - 11:00 | 0 | 0 | 0 | 0 |
| 22.02.2015 11:00 - 12:00 | 0 | 0 | 0 | 0 |
| 22.02.2015 12:00 - 13:00 | 0 | 0 | 0 | 0 |
| 22.02.2015 13:00 - 14:00 | 0 | 0 | 0 | 0 |
| 22.02.2015 14:00 - 15:00 | 0 | 0 | 0 | 0 |
| 22.02.2015 15:00 - 16:00 | 0 | 0 | 0 | 0 |
| 22.02.2015 16:00 - 17:00 | 0 | 0 | 0 | 0 |
| 22.02.2015 17:00 - 18:00 | 0 | 0 | 0 | 0 |
| 22.02.2015 18:00 - 19:00 | 0 | 0 | 0 | 0 |
| 22.02.2015 19:00 - 20:00 | 0 | 0 | 0 | 0 |
| 22.02.2015 20:00 - 21:00 | 0 | 0 | 0 | 0 |
| 22.02.2015 21:00 - 22:00 | 0 | 0 | 0 | 0 |
| 22.02.2015 22:00 - 23:00 | 0 | -500 | 0 | 0 |
| 22.02.2015 23:00 - 24:00 | 0 | -500 | 0 | 0 |
| 23.02.2015 00:00 - 01:00 | 0 | -500 | 0 | 0 |
| 23.02.2015 01:00 - 02:00 | 0 | -500 | 0 | 0 |
| 23.02.2015 02:00 - 03:00 | 0 | -900 | 0 | 0 |
| 23.02.2015 03:00 - 04:00 | 0 | -900 | 0 | 0 |
| 23.02.2015 04:00 - 05:00 | 0 | -900 | 0 | 0 |
| 23.02.2015 05:00 - 06:00 | 0 | -900 | 0 | 0 |
| 23.02.2015 06:00 - 07:00 | 0 | 0 | 0 | 0 |
| 23.02.2015 07:00 - 08:00 | 0 | 0 | 0 | 0 |
| 23.02.2015 08:00 - 09:00 | 0 | 0 | 0 | 0 |
| 23.02.2015 09:00 - 10:00 | 0 | 0 | 0 | 0 |
| 23.02.2015 10:00 - 11:00 | 0 | 0 | 0 | 0 |
| 23.02.2015 11:00 - 12:00 | 0 | 0 | 0 | 0 |
| 23.02.2015 12:00 - 13:00 | 0 | 0 | 0 | 0 |
| 23.02.2015 13:00 - 14:00 | 0 | 0 | 0 | 0 |
| 23.02.2015 14:00 - 15:00 | 0 | 0 | 0 | 0 |
| 23.02.2015 15:00 - 16:00 | 0 | 0 | 0 | 0 |
| 23.02.2015 16:00 - 17:00 | 0 | 0 | 0 | 0 |
| 23.02.2015 17:00 - 18:00 | 0 | 0 | 0 | 0 |
| 23.02.2015 18:00 - 19:00 | 0 | 0 | 0 | 0 |
| 23.02.2015 19:00 - 20:00 | 0 | 0 | 0 | 0 |
| 23.02.2015 20:00 - 21:00 | 0 | 0 | 0 | 0 |
| 23.02.2015 21:00 - 22:00 | 0 | 0 | 0 | 0 |
| 23.02.2015 22:00 - 23:00 | 0 | 0 | 0 | 0 |
| 23.02.2015 23:00 - 24:00 | 0 | -522 | 0 | 0 |
| 24.02.2015 00:00 - 01:00 | 0 | -522 | 0 | 0 |
| 24.02.2015 01:00 - 02:00 | 0 | -522 | 0 | 0 |
| 24.02.2015 02:00 - 03:00 | 0 | -922 | 0 | 0 |
| 24.02.2015 03:00 - 04:00 | 0 | -922 | 0 | 0 |
| 24.02.2015 04:00 - 05:00 | 0 | -922 | 0 | 0 |
| 24.02.2015 05:00 - 06:00 | 0 | -922 | 0 | 0 |
| 24.02.2015 06:00 - 07:00 | 0 | 0 | 0 | 0 |
| 24.02.2015 07:00 - 08:00 | 0 | 0 | 0 | 0 |
| 24.02.2015 08:00 - 09:00 | 0 | 0 | 0 | 0 |
| 24.02.2015 09:00 - 10:00 | 0 | 0 | 0 | 0 |
| 24.02.2015 10:00 - 11:00 | 0 | 0 | 0 | 0 |
| 24.02.2015 11:00 - 12:00 | 0 | 0 | 0 | 0 |
| 24.02.2015 12:00 - 13:00 | 0 | 0 | 0 | 0 |
| 24.02.2015 13:00 - 14:00 | 0 | 0 | 0 | 0 |
| 24.02.2015 14:00 - 15:00 | 0 | 0 | 0 | 0 |
| 24.02.2015 15:00 - 16:00 | 0 | 0 | 0 | 0 |
| 24.02.2015 16:00 - 17:00 | 0 | 0 | 0 | 0 |
| 24.02.2015 17:00 - 18:00 | 0 | 0 | 0 | 0 |
| 24.02.2015 18:00 - 19:00 | 0 | 0 | 0 | 0 |
| 24.02.2015 19:00 - 20:00 | 0 | 0 | 0 | 0 |
| 24.02.2015 20:00 - 21:00 | 0 | 0 | 0 | 0 |
| 24.02.2015 21:00 - 22:00 | 0 | 0 | 0 | 0 |
| 24.02.2015 22:00 - 23:00 | 0 | 0 | 0 | 0 |
| 24.02.2015 23:00 - 24:00 | 0 | 0 | 0 | 0 |
| 25.02.2015 00:00 - 01:00 | 0 | 0 | 0 | 0 |
| 25.02.2015 01:00 - 02:00 | 0 | 0 | 0 | 0 |
| 25.02.2015 02:00 - 03:00 | 0 | -900 | 0 | 0 |
| 25.02.2015 03:00 - 04:00 | 0 | -900 | 0 | 0 |
| 25.02.2015 04:00 - 05:00 | 0 | -900 | 0 | 0 |
| 25.02.2015 05:00 - 06:00 | 0 | -900 | 0 | 0 |
| 25.02.2015 06:00 - 07:00 | 0 | 0 | 0 | 0 |
| 25.02.2015 07:00 - 08:00 | 0 | 0 | 0 | 0 |
| 25.02.2015 08:00 - 09:00 | 0 | 0 | 0 | 0 |
| 25.02.2015 09:00 - 10:00 | 0 | 0 | 0 | 0 |
| 25.02.2015 10:00 - 11:00 | 0 | 0 | 0 | 0 |
| 25.02.2015 11:00 - 12:00 | 0 | 0 | 0 | 0 |
| 25.02.2015 12:00 - 13:00 | 0 | 0 | 0 | 0 |
| 25.02.2015 13:00 - 14:00 | 0 | 0 | 0 | 0 |
| 25.02.2015 14:00 - 15:00 | 0 | 0 | 0 | 0 |
| 25.02.2015 15:00 - 16:00 | 0 | 0 | 0 | 0 |
| 25.02.2015 16:00 - 17:00 | 0 | 0 | 0 | 0 |
| 25.02.2015 17:00 - 18:00 | 0 | 0 | 0 | 0 |
| 25.02.2015 18:00 - 19:00 | 0 | 0 | 0 | 0 |
| 25.02.2015 19:00 - 20:00 | 0 | 0 | 0 | 0 |
| 25.02.2015 20:00 - 21:00 | 0 | 0 | 0 | 0 |
| 25.02.2015 21:00 - 22:00 | 0 | 0 | 0 | 0 |
| 25.02.2015 22:00 - 23:00 | 0 | 0 | 0 | 0 |
| 25.02.2015 23:00 - 24:00 | 0 | 0 | 0 | 0 |
| 26.02.2015 00:00 - 01:00 | 0 | 0 | 0 | 0 |
| 26.02.2015 01:00 - 02:00 | 0 | 0 | 0 | 0 |
| 26.02.2015 02:00 - 03:00 | 0 | -400 | 0 | 0 |
| 26.02.2015 03:00 - 04:00 | 0 | -400 | 0 | 0 |
| 26.02.2015 04:00 - 05:00 | 0 | -400 | 0 | 0 |
| 26.02.2015 05:00 - 06:00 | 0 | -400 | 0 | 0 |
| 26.02.2015 06:00 - 07:00 | 0 | 0 | 0 | 0 |
| 26.02.2015 07:00 - 08:00 | 0 | 0 | 0 | 0 |
| 26.02.2015 08:00 - 09:00 | 0 | 0 | 0 | 0 |
| 26.02.2015 09:00 - 10:00 | 0 | 0 | 0 | 0 |
| 26.02.2015 10:00 - 11:00 | 0 | 0 | 0 | 0 |
| 26.02.2015 11:00 - 12:00 | 0 | 0 | 0 | 0 |
| 26.02.2015 12:00 - 13:00 | 0 | 0 | 0 | 0 |
| 26.02.2015 13:00 - 14:00 | 0 | 0 | 0 | 0 |
| 26.02.2015 14:00 - 15:00 | 0 | 0 | 0 | 0 |
| 26.02.2015 15:00 - 16:00 | 0 | 0 | 0 | 0 |
| 26.02.2015 16:00 - 17:00 | 0 | 0 | 0 | 0 |
| 26.02.2015 17:00 - 18:00 | 0 | 0 | 0 | 0 |
| 26.02.2015 18:00 - 19:00 | 0 | 0 | 0 | 0 |
| 26.02.2015 19:00 - 20:00 | 0 | 0 | 0 | 0 |
| 26.02.2015 20:00 - 21:00 | 0 | 0 | 0 | 0 |
| 26.02.2015 21:00 - 22:00 | 0 | 0 | 0 | 0 |
| 26.02.2015 22:00 - 23:00 | 0 | 0 | 0 | 0 |
| 26.02.2015 23:00 - 24:00 | 0 | 0 | 0 | 0 |
| 27.02.2015 00:00 - 01:00 | 0 | 0 | 0 | 0 |
| 27.02.2015 01:00 - 02:00 | 0 | 0 | 0 | 0 |
| 27.02.2015 02:00 - 03:00 | 0 | -421 | 0 | 0 |
| 27.02.2015 03:00 - 04:00 | 0 | -921 | 0 | 0 |
| 27.02.2015 04:00 - 05:00 | 0 | -921 | 0 | 0 |
| 27.02.2015 05:00 - 06:00 | 0 | -921 | 0 | 0 |
| 27.02.2015 06:00 - 07:00 | 0 | 0 | 0 | 0 |
| 27.02.2015 07:00 - 08:00 | 0 | 0 | 0 | 0 |
| 27.02.2015 08:00 - 09:00 | 0 | 0 | 0 | 0 |
| 27.02.2015 09:00 - 10:00 | 0 | 0 | 0 | 0 |
| 27.02.2015 10:00 - 11:00 | 0 | 0 | 0 | 0 |
| 27.02.2015 11:00 - 12:00 | 0 | 0 | 0 | 0 |
| 27.02.2015 12:00 - 13:00 | 0 | 0 | 0 | 0 |
| 27.02.2015 13:00 - 14:00 | 0 | 0 | 0 | 0 |
| 27.02.2015 14:00 - 15:00 | 0 | 0 | 0 | 0 |
| 27.02.2015 15:00 - 16:00 | 0 | 0 | 0 | 0 |
| 27.02.2015 16:00 - 17:00 | 0 | 0 | 0 | 0 |
| 27.02.2015 17:00 - 18:00 | 0 | 0 | 0 | 0 |
| 27.02.2015 18:00 - 19:00 | 0 | 0 | 0 | 0 |
| 27.02.2015 19:00 - 20:00 | 0 | 0 | 0 | 0 |
| 27.02.2015 20:00 - 21:00 | 0 | 0 | 0 | 0 |
| 27.02.2015 21:00 - 22:00 | 0 | 0 | 0 | 0 |
| 27.02.2015 22:00 - 23:00 | 0 | 0 | 0 | 0 |
| 27.02.2015 23:00 - 24:00 | 0 | 0 | 0 | 0 |
| 28.02.2015 00:00 - 01:00 | 0 | 0 | 0 | 0 |
| 28.02.2015 01:00 - 02:00 | 0 | 0 | 0 | 0 |
| 28.02.2015 02:00 - 03:00 | 0 | 0 | 0 | 0 |
| 28.02.2015 03:00 - 04:00 | 0 | 0 | 0 | 0 |
| 28.02.2015 04:00 - 05:00 | 0 | 0 | 0 | 0 |
| 28.02.2015 05:00 - 06:00 | 0 | 0 | 0 | 0 |
| 28.02.2015 06:00 - 07:00 | 0 | 0 | 0 | 0 |
| 28.02.2015 07:00 - 08:00 | 0 | 0 | 0 | 0 |
| 28.02.2015 08:00 - 09:00 | 0 | 0 | 0 | 0 |
| 28.02.2015 09:00 - 10:00 | 0 | 0 | 0 | 0 |
| 28.02.2015 10:00 - 11:00 | 0 | 0 | 0 | 0 |
| 28.02.2015 11:00 - 12:00 | 0 | 0 | 0 | 0 |
| 28.02.2015 12:00 - 13:00 | 0 | 0 | 0 | 0 |
| 28.02.2015 13:00 - 14:00 | 0 | 0 | 0 | 0 |
| 28.02.2015 14:00 - 15:00 | 0 | 0 | 0 | 0 |
| 28.02.2015 15:00 - 16:00 | 0 | 0 | 0 | 0 |
| 28.02.2015 16:00 - 17:00 | 0 | -200 | 0 | 0 |
| 28.02.2015 17:00 - 18:00 | 0 | -200 | 0 | 0 |
| 28.02.2015 18:00 - 19:00 | 0 | -400 | 0 | 0 |
| 28.02.2015 19:00 - 20:00 | 0 | -400 | 0 | 0 |
| 28.02.2015 20:00 - 21:00 | 0 | -400 | 0 | 0 |
| 28.02.2015 21:00 - 22:00 | 0 | -400 | 0 | 0 |
| 28.02.2015 22:00 - 23:00 | 0 | -400 | 0 | 0 |
| 28.02.2015 23:00 - 24:00 | 0 | -400 | 0 | 0 |
| 01.03.2015 00:00 - 01:00 | 0 | -1000 | 0 | 0 |
| 01.03.2015 01:00 - 02:00 | 0 | -1000 | 0 | 0 |
| 01.03.2015 02:00 - 03:00 | 0 | -1000 | 0 | 0 |
| 01.03.2015 03:00 - 04:00 | 0 | -1000 | 0 | 0 |
| 01.03.2015 04:00 - 05:00 | 0 | -1000 | 0 | 0 |
| 01.03.2015 05:00 - 06:00 | 0 | -1000 | 0 | 0 |